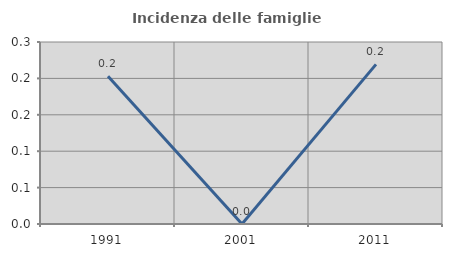
| Category | Incidenza delle famiglie numerose |
|---|---|
| 1991.0 | 0.203 |
| 2001.0 | 0 |
| 2011.0 | 0.219 |